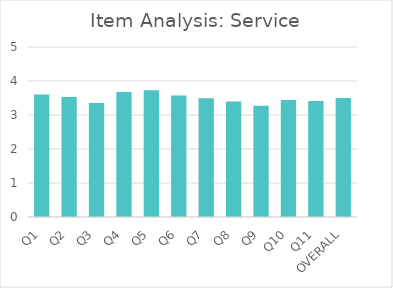
| Category | Series 0 |
|---|---|
| Q1 | 3.6 |
| Q2 | 3.53 |
| Q3 | 3.35 |
| Q4 | 3.68 |
| Q5 | 3.73 |
| Q6 | 3.57 |
| Q7 | 3.49 |
| Q8 | 3.4 |
| Q9 | 3.27 |
| Q10 | 3.44 |
| Q11 | 3.41 |
| OVERALL | 3.5 |